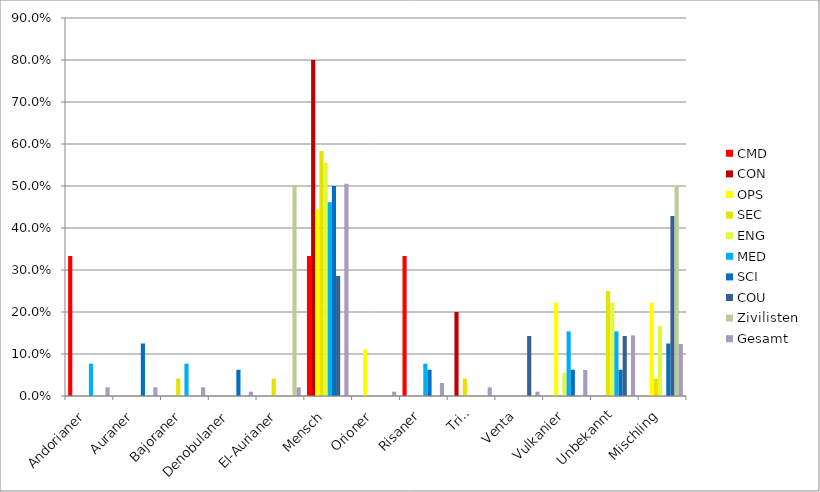
| Category | CMD | CON | OPS | SEC | ENG | MED | SCI | COU | Zivilisten | Gesamt  |
|---|---|---|---|---|---|---|---|---|---|---|
| Andorianer | 0.333 | 0 | 0 | 0 | 0 | 0.077 | 0 | 0 | 0 | 0.021 |
| Auraner | 0 | 0 | 0 | 0 | 0 | 0 | 0.125 | 0 | 0 | 0.021 |
| Bajoraner | 0 | 0 | 0 | 0.042 | 0 | 0.077 | 0 | 0 | 0 | 0.021 |
| Denobulaner | 0 | 0 | 0 | 0 | 0 | 0 | 0.062 | 0 | 0 | 0.01 |
| El-Aurianer | 0 | 0 | 0 | 0.042 | 0 | 0 | 0 | 0 | 0.5 | 0.021 |
| Mensch | 0.333 | 0.8 | 0.444 | 0.583 | 0.556 | 0.462 | 0.5 | 0.286 | 0 | 0.505 |
| Orioner | 0 | 0 | 0.111 | 0 | 0 | 0 | 0 | 0 | 0 | 0.01 |
| Risaner | 0.333 | 0 | 0 | 0 | 0 | 0.077 | 0.062 | 0 | 0 | 0.031 |
| Trill | 0 | 0.2 | 0 | 0.042 | 0 | 0 | 0 | 0 | 0 | 0.021 |
| Venta | 0 | 0 | 0 | 0 | 0 | 0 | 0 | 0.143 | 0 | 0.01 |
| Vulkanier | 0 | 0 | 0.222 | 0 | 0.056 | 0.154 | 0.062 | 0 | 0 | 0.062 |
| Unbekannt | 0 | 0 | 0 | 0.25 | 0.222 | 0.154 | 0.062 | 0.143 | 0 | 0.144 |
| Mischling | 0 | 0 | 0.222 | 0.042 | 0.167 | 0 | 0.125 | 0.429 | 0.5 | 0.124 |